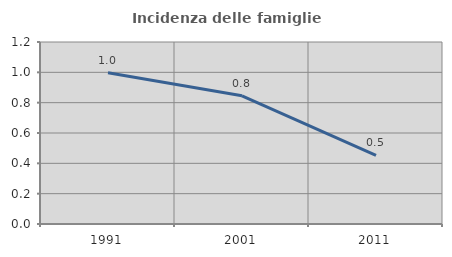
| Category | Incidenza delle famiglie numerose |
|---|---|
| 1991.0 | 0.998 |
| 2001.0 | 0.845 |
| 2011.0 | 0.452 |